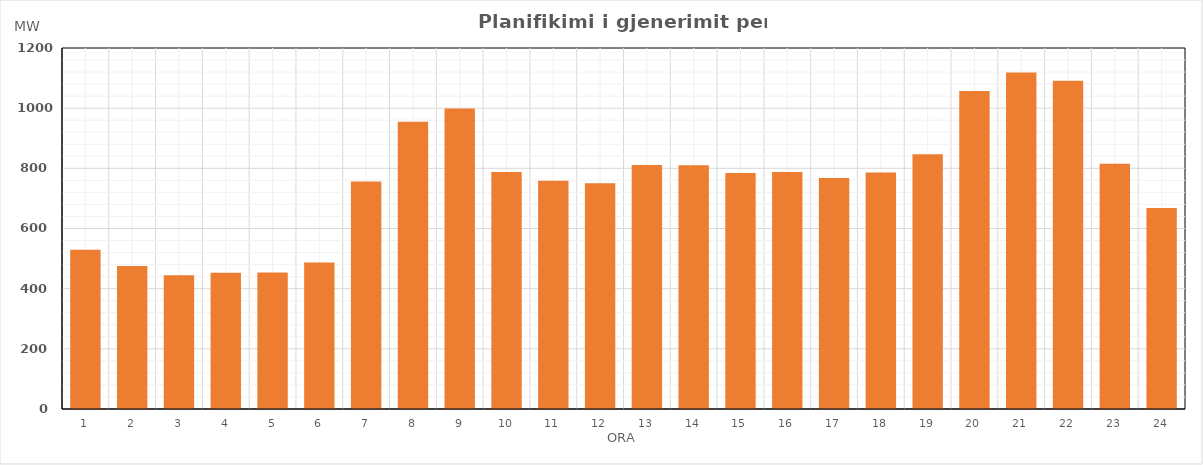
| Category | Max (MW) |
|---|---|
| 0 | 529.73 |
| 1 | 475.45 |
| 2 | 444.93 |
| 3 | 453.06 |
| 4 | 453.45 |
| 5 | 487.12 |
| 6 | 756.37 |
| 7 | 955.17 |
| 8 | 999.22 |
| 9 | 787.5 |
| 10 | 758.49 |
| 11 | 750.54 |
| 12 | 811.38 |
| 13 | 810.23 |
| 14 | 784.73 |
| 15 | 787.75 |
| 16 | 767.69 |
| 17 | 786.54 |
| 18 | 846.46 |
| 19 | 1056.82 |
| 20 | 1118.61 |
| 21 | 1091.04 |
| 22 | 815.01 |
| 23 | 667.81 |